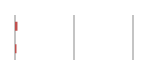
| Category | Series 0 |
|---|---|
| 0 | 0.012 |
| 1 | 0.004 |